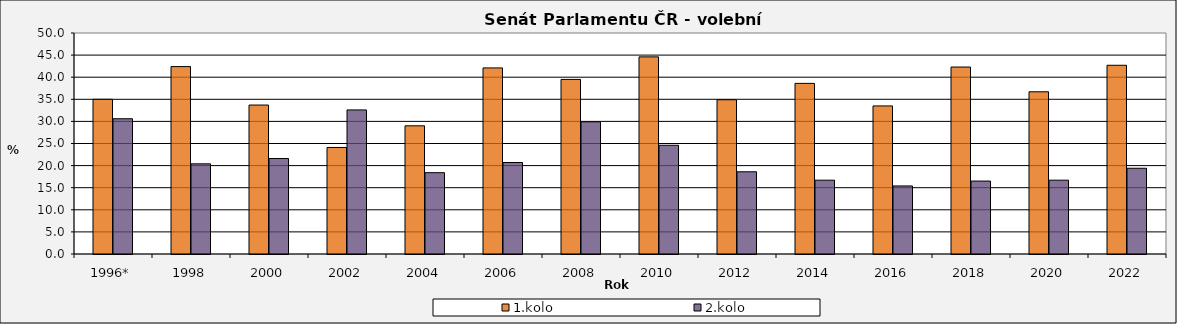
| Category | 1.kolo | 2.kolo |
|---|---|---|
| 1996* | 35 | 30.6 |
| 1998 | 42.4 | 20.4 |
| 2000 | 33.7 | 21.6 |
| 2002 | 24.1 | 32.6 |
| 2004 | 29 | 18.4 |
| 2006 | 42.1 | 20.7 |
| 2008 | 39.5 | 29.9 |
| 2010 | 44.6 | 24.6 |
| 2012 | 34.9 | 18.6 |
| 2014 | 38.6 | 16.7 |
| 2016 | 33.5 | 15.4 |
| 2018 | 42.3 | 16.5 |
| 2020 | 36.7 | 16.7 |
| 2022 | 42.7 | 19.4 |